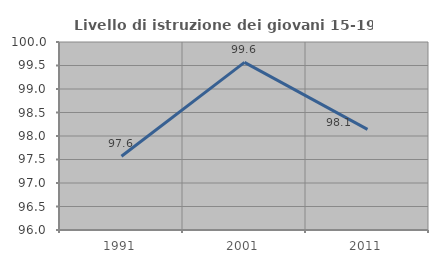
| Category | Livello di istruzione dei giovani 15-19 anni |
|---|---|
| 1991.0 | 97.569 |
| 2001.0 | 99.567 |
| 2011.0 | 98.141 |